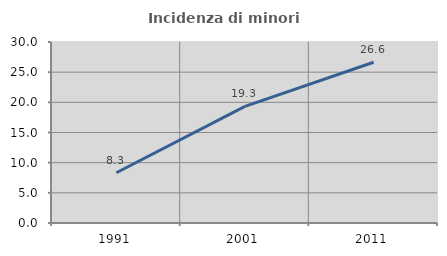
| Category | Incidenza di minori stranieri |
|---|---|
| 1991.0 | 8.333 |
| 2001.0 | 19.328 |
| 2011.0 | 26.639 |